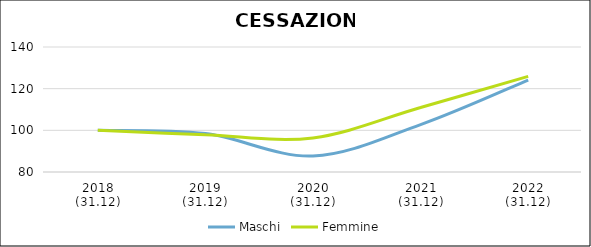
| Category | Maschi | Femmine |
|---|---|---|
| 2018
(31.12) | 100 | 100 |
| 2019
(31.12) | 98.432 | 97.888 |
| 2020
(31.12) | 87.671 | 96.36 |
| 2021
(31.12) | 102.76 | 110.937 |
| 2022
(31.12) | 124.148 | 125.872 |